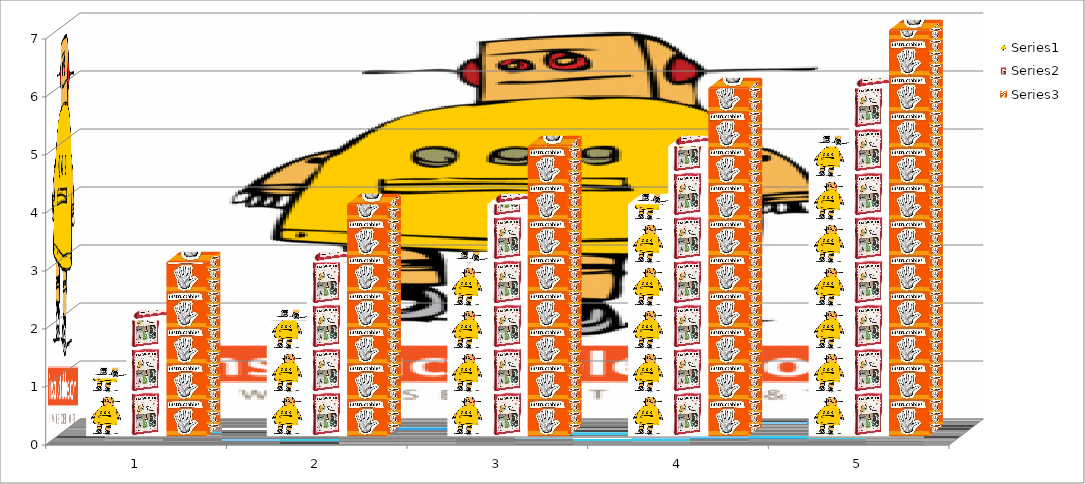
| Category | Series 0 | Series 1 | Series 2 |
|---|---|---|---|
| 0 | 1 | 2 | 3 |
| 1 | 2 | 3 | 4 |
| 2 | 3 | 4 | 5 |
| 3 | 4 | 5 | 6 |
| 4 | 5 | 6 | 7 |